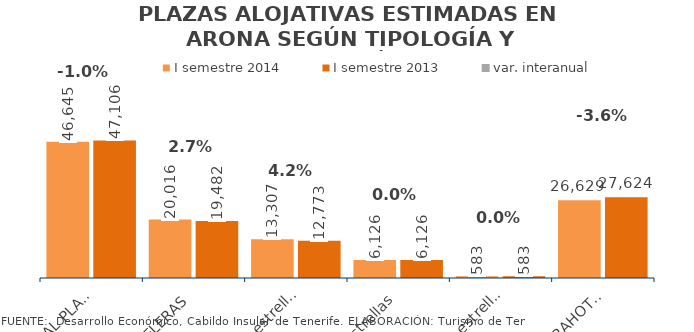
| Category | I semestre 2014 | I semestre 2013 |
|---|---|---|
| TOTAL PLAZAS | 46645 | 47106 |
| HOTELERAS | 20016 | 19482 |
| 5 y 4 estrellas | 13307 | 12773 |
| 3 estrellas | 6126 | 6126 |
| 1 y 2 estrellas | 583 | 583 |
| EXTRAHOTELERAS | 26629 | 27624 |